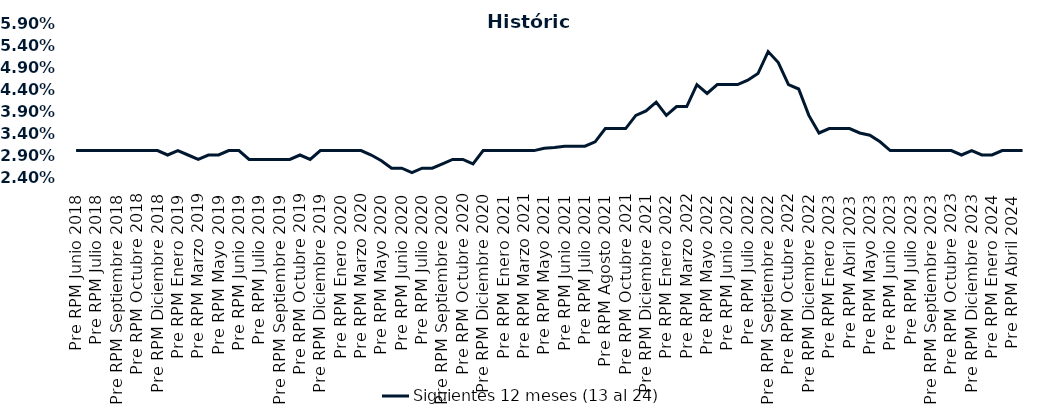
| Category | Siguientes 12 meses (13 al 24)  |
|---|---|
| Pre RPM Junio 2018 | 0.03 |
| Post RPM Junio 2018 | 0.03 |
| Pre RPM Julio 2018 | 0.03 |
| Post RPM Julio 2018 | 0.03 |
| Pre RPM Septiembre 2018 | 0.03 |
| Post RPM Septiembre 2018 | 0.03 |
| Pre RPM Octubre 2018 | 0.03 |
| Post RPM Octubre 2018 | 0.03 |
| Pre RPM Diciembre 2018 | 0.03 |
| Post RPM Diciembre 2018 | 0.029 |
| Pre RPM Enero 2019 | 0.03 |
| Post RPM Enero 2019 | 0.029 |
| Pre RPM Marzo 2019 | 0.028 |
| Post RPM Marzo 2019 | 0.029 |
| Pre RPM Mayo 2019 | 0.029 |
| Post RPM Mayo 2019 | 0.03 |
| Pre RPM Junio 2019 | 0.03 |
| Post RPM Junio 2019 | 0.028 |
| Pre RPM Julio 2019 | 0.028 |
| Post RPM Julio 2019 | 0.028 |
| Pre RPM Septiembre 2019 | 0.028 |
| Post RPM Septiembre 2019 | 0.028 |
| Pre RPM Octubre 2019 | 0.029 |
| Post RPM Octubre 2019 | 0.028 |
| Pre RPM Diciembre 2019 | 0.03 |
| Post RPM Diciembre 2019 | 0.03 |
| Pre RPM Enero 2020 | 0.03 |
| Post RPM Enero 2020 | 0.03 |
| Pre RPM Marzo 2020 | 0.03 |
| Post RPM Marzo 2020 | 0.029 |
| Pre RPM Mayo 2020 | 0.028 |
| Post RPM Mayo 2020 | 0.026 |
| Pre RPM Junio 2020 | 0.026 |
| Post RPM Junio 2020 | 0.025 |
| Pre RPM Julio 2020 | 0.026 |
| Post RPM Julio 2020 | 0.026 |
| Pre RPM Septiembre 2020 | 0.027 |
| Post RPM Septiembre 2020 | 0.028 |
| Pre RPM Octubre 2020 | 0.028 |
| Post RPM Octubre 2020 | 0.027 |
| Pre RPM Diciembre 2020 | 0.03 |
| Post RPM Diciembre 2020 | 0.03 |
| Pre RPM Enero 2021 | 0.03 |
| Post RPM Enero 2021 | 0.03 |
| Pre RPM Marzo 2021 | 0.03 |
| Post RPM Marzo 2021 | 0.03 |
| Pre RPM Mayo 2021 | 0.031 |
| Post RPM Mayo 2021 | 0.031 |
| Pre RPM Junio 2021 | 0.031 |
| Post RPM Junio 2021 | 0.031 |
| Pre RPM Julio 2021 | 0.031 |
| Post RPM Julio 2021 | 0.032 |
| Pre RPM Agosto 2021 | 0.035 |
| Post RPM Agosto 2021 | 0.035 |
| Pre RPM Octubre 2021 | 0.035 |
| Post RPM Octubre 2021 | 0.038 |
| Pre RPM Diciembre 2021 | 0.039 |
| Post RPM Diciembre 2021 | 0.041 |
| Pre RPM Enero 2022 | 0.038 |
| Post RPM Enero 2022 | 0.04 |
| Pre RPM Marzo 2022 | 0.04 |
| Post RPM Marzo 2022 | 0.045 |
| Pre RPM Mayo 2022 | 0.043 |
| Post RPM Mayo 2022 | 0.045 |
| Pre RPM Junio 2022 | 0.045 |
| Post RPM Junio 2022 | 0.045 |
| Pre RPM Julio 2022 | 0.046 |
| Post RPM Julio 2022 | 0.048 |
| Pre RPM Septiembre 2022 | 0.052 |
| Post RPM Septiembre 2022 | 0.05 |
| Pre RPM Octubre 2022 | 0.045 |
| Post RPM Octubre 2022 | 0.044 |
| Pre RPM Diciembre 2022 | 0.038 |
| Post RPM Diciembre 2022 | 0.034 |
| Pre RPM Enero 2023 | 0.035 |
| Post RPM Enero 2023 | 0.035 |
| Pre RPM Abril 2023 | 0.035 |
| Post RPM Abril 2023 | 0.034 |
| Pre RPM Mayo 2023 | 0.034 |
| Post RPM Mayo 2023 | 0.032 |
| Pre RPM Junio 2023 | 0.03 |
| Post RPM Junio 2023 | 0.03 |
| Pre RPM Julio 2023 | 0.03 |
| Post RPM Julio 2023 | 0.03 |
| Pre RPM Septiembre 2023 | 0.03 |
| Post RPM Septiembre 2023 | 0.03 |
| Pre RPM Octubre 2023 | 0.03 |
| Post RPM Octubre 2023 | 0.029 |
| Pre RPM Diciembre 2023 | 0.03 |
| Post RPM Diciembre 2023 | 0.029 |
| Pre RPM Enero 2024 | 0.029 |
| Post RPM Enero 2024 | 0.03 |
| Pre RPM Abril 2024 | 0.03 |
| Post RPM Abril 2024 | 0.03 |